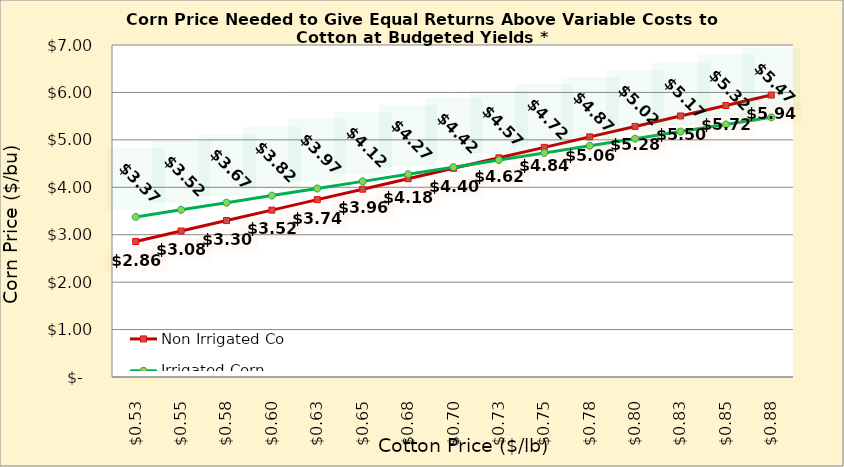
| Category | Non Irrigated Corn | Irrigated Corn |
|---|---|---|
| 0.5249999999999998 | 2.857 | 3.375 |
| 0.5499999999999998 | 3.077 | 3.525 |
| 0.5749999999999998 | 3.298 | 3.675 |
| 0.5999999999999999 | 3.519 | 3.825 |
| 0.6249999999999999 | 3.739 | 3.975 |
| 0.6499999999999999 | 3.96 | 4.125 |
| 0.6749999999999999 | 4.18 | 4.275 |
| 0.7 | 4.401 | 4.425 |
| 0.725 | 4.621 | 4.575 |
| 0.75 | 4.842 | 4.725 |
| 0.775 | 5.063 | 4.875 |
| 0.8 | 5.283 | 5.025 |
| 0.8250000000000001 | 5.504 | 5.175 |
| 0.8500000000000001 | 5.724 | 5.325 |
| 0.8750000000000001 | 5.945 | 5.475 |